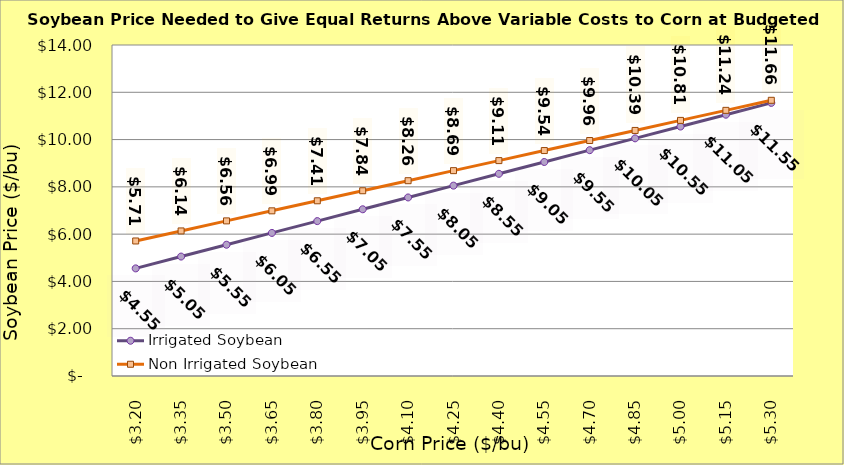
| Category | Irrigated Soybean | Non Irrigated Soybean |
|---|---|---|
| 3.2 | 4.552 | 5.711 |
| 3.35 | 5.052 | 6.136 |
| 3.5 | 5.552 | 6.561 |
| 3.65 | 6.052 | 6.986 |
| 3.8 | 6.552 | 7.411 |
| 3.9499999999999997 | 7.052 | 7.836 |
| 4.1 | 7.552 | 8.261 |
| 4.25 | 8.052 | 8.686 |
| 4.4 | 8.552 | 9.111 |
| 4.550000000000001 | 9.052 | 9.536 |
| 4.700000000000001 | 9.552 | 9.961 |
| 4.850000000000001 | 10.052 | 10.386 |
| 5.000000000000002 | 10.552 | 10.811 |
| 5.150000000000002 | 11.052 | 11.236 |
| 5.3000000000000025 | 11.552 | 11.661 |